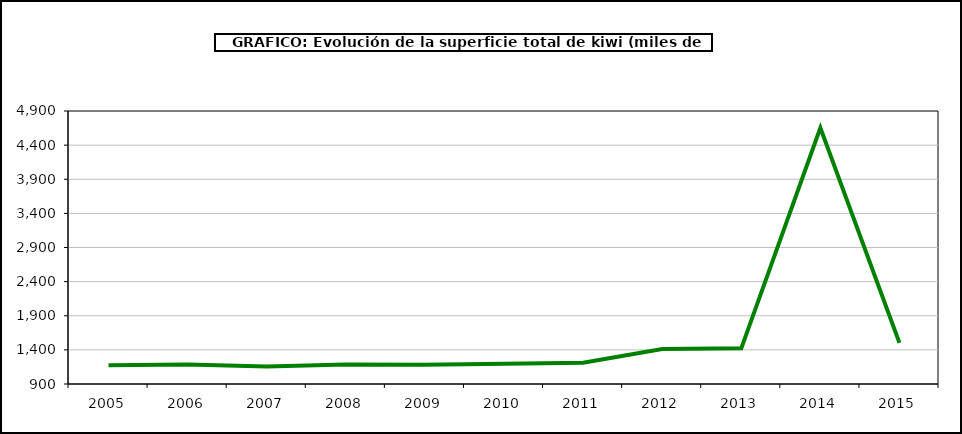
| Category | superficie kiwi |
|---|---|
| 2005.0 | 1174 |
| 2006.0 | 1186 |
| 2007.0 | 1158 |
| 2008.0 | 1187 |
| 2009.0 | 1183 |
| 2010.0 | 1196 |
| 2011.0 | 1213 |
| 2012.0 | 1413 |
| 2013.0 | 1423 |
| 2014.0 | 4653 |
| 2015.0 | 1502 |